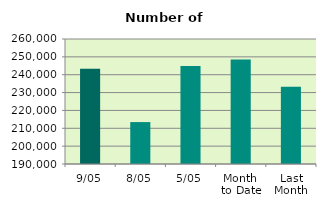
| Category | Series 0 |
|---|---|
| 9/05 | 243358 |
| 8/05 | 213474 |
| 5/05 | 244830 |
| Month 
to Date | 248566.333 |
| Last
Month | 233247 |